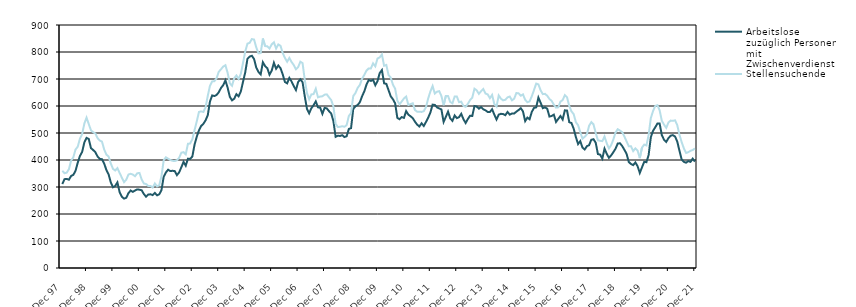
| Category | Arbeitslose zuzüglich Personen mit Zwischenverdienst | Stellensuchende |
|---|---|---|
| 1998-01-01 | 311 | 360 |
| 1998-02-01 | 329 | 351 |
| 1998-03-01 | 330 | 353 |
| 1998-04-01 | 327 | 366 |
| 1998-05-01 | 341 | 398 |
| 1998-06-01 | 345 | 410 |
| 1998-07-01 | 360 | 439 |
| 1998-08-01 | 390 | 449 |
| 1998-09-01 | 415 | 479 |
| 1998-10-01 | 430 | 496 |
| 1998-11-01 | 465 | 535 |
| 1998-12-01 | 482 | 557 |
| 1999-01-01 | 478 | 533 |
| 1999-02-01 | 444 | 510 |
| 1999-03-01 | 437 | 503 |
| 1999-04-01 | 429 | 498 |
| 1999-05-01 | 413 | 481 |
| 1999-06-01 | 404 | 472 |
| 1999-07-01 | 403 | 468 |
| 1999-08-01 | 387 | 439 |
| 1999-09-01 | 363 | 420 |
| 1999-10-01 | 347 | 413 |
| 1999-11-01 | 317 | 387 |
| 1999-12-01 | 299 | 367 |
| 2000-01-01 | 304 | 361 |
| 2000-02-01 | 317 | 370 |
| 2000-03-01 | 281 | 352 |
| 2000-04-01 | 264 | 335 |
| 2000-05-01 | 257 | 318 |
| 2000-06-01 | 260 | 327 |
| 2000-07-01 | 277 | 346 |
| 2000-08-01 | 287 | 349 |
| 2000-09-01 | 282 | 346 |
| 2000-10-01 | 287 | 340 |
| 2000-11-01 | 291 | 351 |
| 2000-12-01 | 290 | 352 |
| 2001-01-01 | 288 | 328 |
| 2001-02-01 | 274 | 313 |
| 2001-03-01 | 264 | 311 |
| 2001-04-01 | 272 | 304 |
| 2001-05-01 | 273 | 304 |
| 2001-06-01 | 270 | 298 |
| 2001-07-01 | 278 | 313 |
| 2001-08-01 | 269 | 302 |
| 2001-09-01 | 273 | 307 |
| 2001-10-01 | 289 | 340 |
| 2001-11-01 | 338 | 399 |
| 2001-12-01 | 354 | 410 |
| 2002-01-01 | 364 | 405 |
| 2002-02-01 | 359 | 400 |
| 2002-03-01 | 360 | 397 |
| 2002-04-01 | 359 | 396 |
| 2002-05-01 | 344 | 399 |
| 2002-06-01 | 354 | 408 |
| 2002-07-01 | 373 | 427 |
| 2002-08-01 | 393 | 429 |
| 2002-09-01 | 379 | 421 |
| 2002-10-01 | 405 | 460 |
| 2002-11-01 | 404 | 461 |
| 2002-12-01 | 413 | 477 |
| 2003-01-01 | 457 | 511 |
| 2003-02-01 | 486 | 543 |
| 2003-03-01 | 510 | 578 |
| 2003-04-01 | 526 | 580 |
| 2003-05-01 | 534 | 578 |
| 2003-06-01 | 547 | 595 |
| 2003-07-01 | 566 | 638 |
| 2003-08-01 | 617 | 675 |
| 2003-09-01 | 639 | 691 |
| 2003-10-01 | 637 | 692 |
| 2003-11-01 | 641 | 703 |
| 2003-12-01 | 651 | 727 |
| 2004-01-01 | 667 | 736 |
| 2004-02-01 | 677 | 746 |
| 2004-03-01 | 695 | 751 |
| 2004-04-01 | 668 | 723 |
| 2004-05-01 | 634 | 684 |
| 2004-06-01 | 621 | 675 |
| 2004-07-01 | 627 | 703 |
| 2004-08-01 | 644 | 713 |
| 2004-09-01 | 636 | 700 |
| 2004-10-01 | 654 | 719 |
| 2004-11-01 | 690 | 760 |
| 2004-12-01 | 725 | 802 |
| 2005-01-01 | 775 | 831 |
| 2005-02-01 | 783 | 834 |
| 2005-03-01 | 786 | 848 |
| 2005-04-01 | 774 | 846 |
| 2005-05-01 | 742 | 817 |
| 2005-06-01 | 726 | 795 |
| 2005-07-01 | 717 | 796 |
| 2005-08-01 | 762 | 850 |
| 2005-09-01 | 748 | 822 |
| 2005-10-01 | 740 | 821 |
| 2005-11-01 | 716 | 813 |
| 2005-12-01 | 731 | 828 |
| 2006-01-01 | 760 | 836 |
| 2006-02-01 | 738 | 813 |
| 2006-03-01 | 750 | 828 |
| 2006-04-01 | 740 | 823 |
| 2006-05-01 | 717 | 796 |
| 2006-06-01 | 689 | 778 |
| 2006-07-01 | 684 | 764 |
| 2006-08-01 | 704 | 778 |
| 2006-09-01 | 691 | 763 |
| 2006-10-01 | 674 | 752 |
| 2006-11-01 | 659 | 736 |
| 2006-12-01 | 689 | 744 |
| 2007-01-01 | 699 | 764 |
| 2007-02-01 | 688 | 759 |
| 2007-03-01 | 636 | 697 |
| 2007-04-01 | 589 | 648 |
| 2007-05-01 | 573 | 625 |
| 2007-06-01 | 592 | 643 |
| 2007-07-01 | 603 | 644 |
| 2007-08-01 | 617 | 664 |
| 2007-09-01 | 595 | 632 |
| 2007-10-01 | 594 | 635 |
| 2007-11-01 | 571 | 636 |
| 2007-12-01 | 593 | 642 |
| 2008-01-01 | 591 | 643 |
| 2008-02-01 | 581 | 632 |
| 2008-03-01 | 572 | 622 |
| 2008-04-01 | 544 | 598 |
| 2008-05-01 | 486 | 534 |
| 2008-06-01 | 490 | 522 |
| 2008-07-01 | 489 | 523 |
| 2008-08-01 | 492 | 525 |
| 2008-09-01 | 485 | 523 |
| 2008-10-01 | 488 | 529 |
| 2008-11-01 | 515 | 563 |
| 2008-12-01 | 518 | 574 |
| 2009-01-01 | 589 | 637 |
| 2009-02-01 | 599 | 648 |
| 2009-03-01 | 604 | 667 |
| 2009-04-01 | 614 | 678 |
| 2009-05-01 | 636 | 701 |
| 2009-06-01 | 654 | 715 |
| 2009-07-01 | 679 | 731 |
| 2009-08-01 | 696 | 739 |
| 2009-09-01 | 693 | 739 |
| 2009-10-01 | 697 | 758 |
| 2009-11-01 | 677 | 747 |
| 2009-12-01 | 692 | 776 |
| 2010-01-01 | 722 | 780 |
| 2010-02-01 | 733 | 791 |
| 2010-03-01 | 684 | 749 |
| 2010-04-01 | 682 | 752 |
| 2010-05-01 | 659 | 715 |
| 2010-06-01 | 636 | 705 |
| 2010-07-01 | 625 | 679 |
| 2010-08-01 | 610 | 664 |
| 2010-09-01 | 556 | 620 |
| 2010-10-01 | 551 | 606 |
| 2010-11-01 | 559 | 617 |
| 2010-12-01 | 556 | 628 |
| 2011-01-01 | 581 | 635 |
| 2011-02-01 | 568 | 604 |
| 2011-03-01 | 562 | 607 |
| 2011-04-01 | 555 | 610 |
| 2011-05-01 | 542 | 585 |
| 2011-06-01 | 531 | 579 |
| 2011-07-01 | 524 | 579 |
| 2011-08-01 | 536 | 578 |
| 2011-09-01 | 526 | 581 |
| 2011-10-01 | 541 | 596 |
| 2011-11-01 | 557 | 628 |
| 2011-12-01 | 576 | 654 |
| 2012-01-01 | 605 | 674 |
| 2012-02-01 | 604 | 646 |
| 2012-03-01 | 595 | 653 |
| 2012-04-01 | 591 | 655 |
| 2012-05-01 | 587 | 637 |
| 2012-06-01 | 541 | 603 |
| 2012-07-01 | 560 | 637 |
| 2012-08-01 | 579 | 637 |
| 2012-09-01 | 554 | 615 |
| 2012-10-01 | 545 | 610 |
| 2012-11-01 | 565 | 635 |
| 2012-12-01 | 555 | 635 |
| 2013-01-01 | 559 | 614 |
| 2013-02-01 | 571 | 616 |
| 2013-03-01 | 551 | 600 |
| 2013-04-01 | 537 | 597 |
| 2013-05-01 | 552 | 608 |
| 2013-06-01 | 564 | 622 |
| 2013-07-01 | 563 | 631 |
| 2013-08-01 | 600 | 664 |
| 2013-09-01 | 598 | 658 |
| 2013-10-01 | 590 | 645 |
| 2013-11-01 | 596 | 655 |
| 2013-12-01 | 588 | 663 |
| 2014-01-01 | 584 | 646 |
| 2014-02-01 | 578 | 643 |
| 2014-03-01 | 578 | 629 |
| 2014-04-01 | 588 | 641 |
| 2014-05-01 | 568 | 607 |
| 2014-06-01 | 550 | 598 |
| 2014-07-01 | 568 | 639 |
| 2014-08-01 | 571 | 627 |
| 2014-09-01 | 570 | 621 |
| 2014-10-01 | 566 | 623 |
| 2014-11-01 | 578 | 632 |
| 2014-12-01 | 568 | 635 |
| 2015-01-01 | 572 | 621 |
| 2015-02-01 | 572 | 627 |
| 2015-03-01 | 579 | 648 |
| 2015-04-01 | 585 | 647 |
| 2015-05-01 | 592 | 638 |
| 2015-06-01 | 580 | 643 |
| 2015-07-01 | 544 | 623 |
| 2015-08-01 | 557 | 614 |
| 2015-09-01 | 551 | 617 |
| 2015-10-01 | 578 | 636 |
| 2015-11-01 | 593 | 659 |
| 2015-12-01 | 595 | 683 |
| 2016-01-01 | 631 | 680 |
| 2016-02-01 | 612 | 658 |
| 2016-03-01 | 592 | 644 |
| 2016-04-01 | 595 | 645 |
| 2016-05-01 | 590 | 638 |
| 2016-06-01 | 561 | 626 |
| 2016-07-01 | 563 | 619 |
| 2016-08-01 | 568 | 605 |
| 2016-09-01 | 541 | 594 |
| 2016-10-01 | 552 | 595 |
| 2016-11-01 | 563 | 616 |
| 2016-12-01 | 550 | 622 |
| 2017-01-01 | 584 | 640 |
| 2017-02-01 | 583 | 632 |
| 2017-03-01 | 540 | 600 |
| 2017-04-01 | 537 | 580 |
| 2017-05-01 | 516 | 570 |
| 2017-06-01 | 485 | 540 |
| 2017-07-01 | 459 | 529 |
| 2017-08-01 | 470 | 503 |
| 2017-09-01 | 446 | 479 |
| 2017-10-01 | 439 | 486 |
| 2017-11-01 | 451 | 495 |
| 2017-12-01 | 455 | 527 |
| 2018-01-01 | 475 | 540 |
| 2018-02-01 | 477 | 532 |
| 2018-03-01 | 464 | 500 |
| 2018-04-01 | 422 | 473 |
| 2018-05-01 | 420 | 471 |
| 2018-06-01 | 405 | 470 |
| 2018-07-01 | 442 | 487 |
| 2018-08-01 | 423 | 462 |
| 2018-09-01 | 408 | 443 |
| 2018-10-01 | 417 | 455 |
| 2018-11-01 | 429 | 476 |
| 2018-12-01 | 442 | 502 |
| 2019-01-01 | 461 | 514 |
| 2019-02-01 | 462 | 509 |
| 2019-03-01 | 452 | 503 |
| 2019-04-01 | 438 | 487 |
| 2019-05-01 | 423 | 469 |
| 2019-06-01 | 393 | 451 |
| 2019-07-01 | 385 | 451 |
| 2019-08-01 | 381 | 433 |
| 2019-09-01 | 391 | 443 |
| 2019-10-01 | 377 | 435 |
| 2019-11-01 | 352 | 407 |
| 2019-12-01 | 373 | 446 |
| 2020-01-01 | 393 | 457 |
| 2020-02-01 | 392 | 454 |
| 2020-03-01 | 418 | 492 |
| 2020-04-01 | 484 | 555 |
| 2020-05-01 | 508 | 581 |
| 2020-06-01 | 521 | 600 |
| 2020-07-01 | 535 | 603 |
| 2020-08-01 | 535 | 584 |
| 2020-09-01 | 492 | 545 |
| 2020-10-01 | 475 | 531 |
| 2020-11-01 | 467 | 519 |
| 2020-12-01 | 481 | 539 |
| 2021-01-01 | 490 | 546 |
| 2021-02-01 | 492 | 545 |
| 2021-03-01 | 487 | 547 |
| 2021-04-01 | 468 | 529 |
| 2021-05-01 | 434 | 493 |
| 2021-06-01 | 402 | 466 |
| 2021-07-01 | 393 | 443 |
| 2021-08-01 | 390 | 426 |
| 2021-09-01 | 396 | 429 |
| 2021-10-01 | 393 | 434 |
| 2021-11-01 | 405 | 437 |
| 2021-12-01 | 394 | 443 |